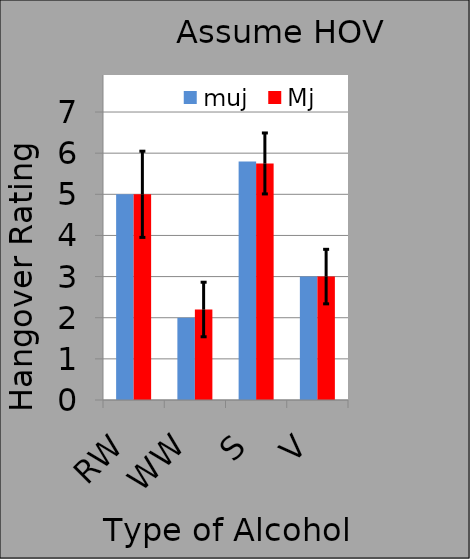
| Category | muj | Mj |
|---|---|---|
| RW | 5 | 5 |
| WW | 2 | 2.2 |
| S | 5.8 | 5.75 |
| V | 3 | 3 |